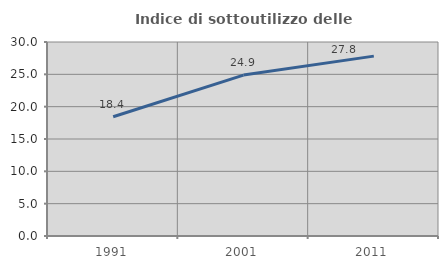
| Category | Indice di sottoutilizzo delle abitazioni  |
|---|---|
| 1991.0 | 18.433 |
| 2001.0 | 24.886 |
| 2011.0 | 27.814 |